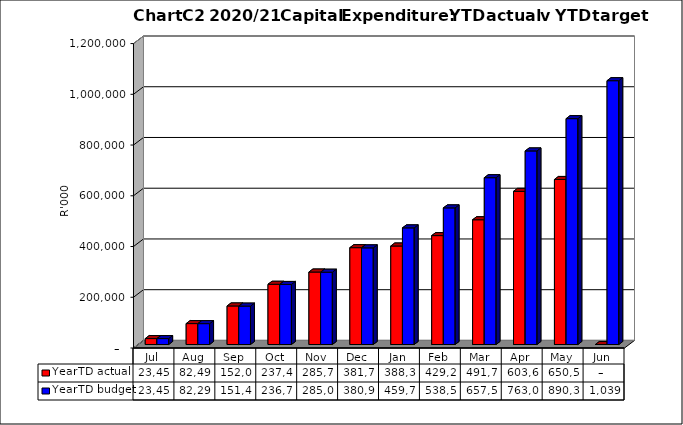
| Category | YearTD actual | YearTD budget |
|---|---|---|
| Jul | 23449713.35 | 23449713.353 |
| Aug | 82492347.842 | 82290541.222 |
| Sep | 152033608.32 | 151417435.557 |
| Oct | 237459289.99 | 236732057.814 |
| Nov | 285752059.8 | 285024827.634 |
| Dec | 381730699.102 | 380978741.757 |
| Jan | 388301468.96 | 459759496.134 |
| Feb | 429270161.99 | 538540239.449 |
| Mar | 491747287.792 | 657535142.431 |
| Apr | 603631812.027 | 763074825.564 |
| May | 650554071.444 | 890305443.132 |
| Jun | 0 | 1039881030.361 |